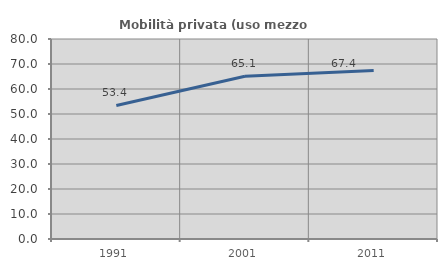
| Category | Mobilità privata (uso mezzo privato) |
|---|---|
| 1991.0 | 53.425 |
| 2001.0 | 65.079 |
| 2011.0 | 67.442 |